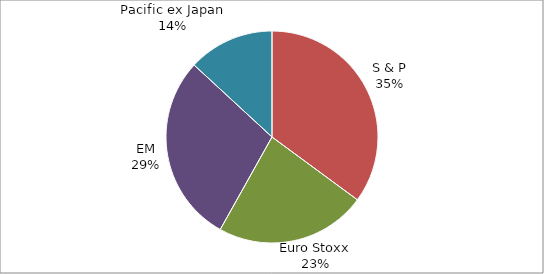
| Category | Series 0 |
|---|---|
| S & P | 0.351 |
| Euro Stoxx | 0.23 |
| EM | 0.288 |
| Pacific ex Japan | 0.131 |